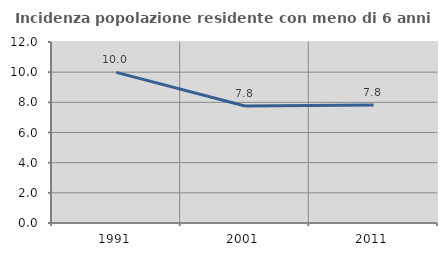
| Category | Incidenza popolazione residente con meno di 6 anni |
|---|---|
| 1991.0 | 9.988 |
| 2001.0 | 7.761 |
| 2011.0 | 7.829 |